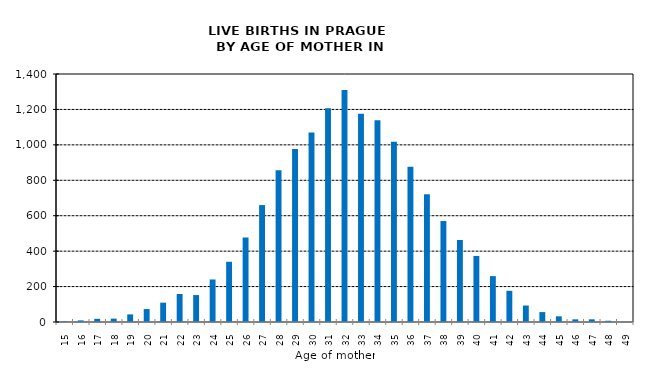
| Category | Series 1 |
|---|---|
| 15.0 | 4 |
| 16.0 | 9 |
| 17.0 | 18 |
| 18.0 | 19 |
| 19.0 | 43 |
| 20.0 | 73 |
| 21.0 | 109 |
| 22.0 | 158 |
| 23.0 | 152 |
| 24.0 | 240 |
| 25.0 | 340 |
| 26.0 | 477 |
| 27.0 | 660 |
| 28.0 | 857 |
| 29.0 | 977 |
| 30.0 | 1070 |
| 31.0 | 1207 |
| 32.0 | 1310 |
| 33.0 | 1176 |
| 34.0 | 1139 |
| 35.0 | 1018 |
| 36.0 | 876 |
| 37.0 | 721 |
| 38.0 | 570 |
| 39.0 | 463 |
| 40.0 | 373 |
| 41.0 | 259 |
| 42.0 | 176 |
| 43.0 | 93 |
| 44.0 | 56 |
| 45.0 | 32 |
| 46.0 | 15 |
| 47.0 | 15 |
| 48.0 | 7 |
| 49.0 | 1 |